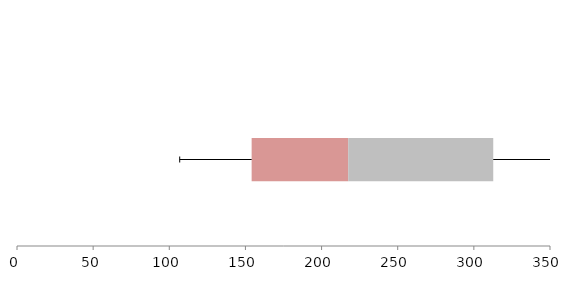
| Category | Series 1 | Series 2 | Series 3 |
|---|---|---|---|
| 0 | 154.08 | 63.405 | 95.247 |